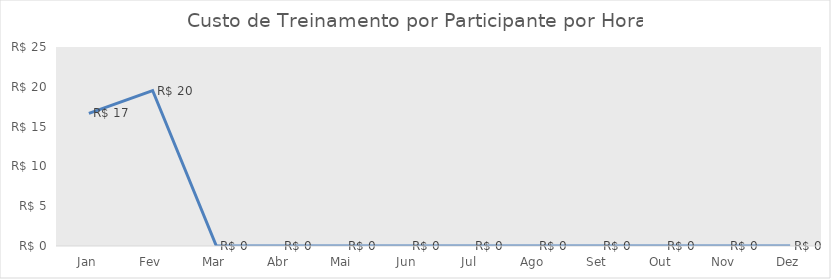
| Category | Custo de Treinamento por Participante por Hora |
|---|---|
| Jan | 16.667 |
| Fev | 19.531 |
| Mar | 0 |
| Abr | 0 |
| Mai | 0 |
| Jun | 0 |
| Jul | 0 |
| Ago | 0 |
| Set | 0 |
| Out | 0 |
| Nov | 0 |
| Dez | 0 |